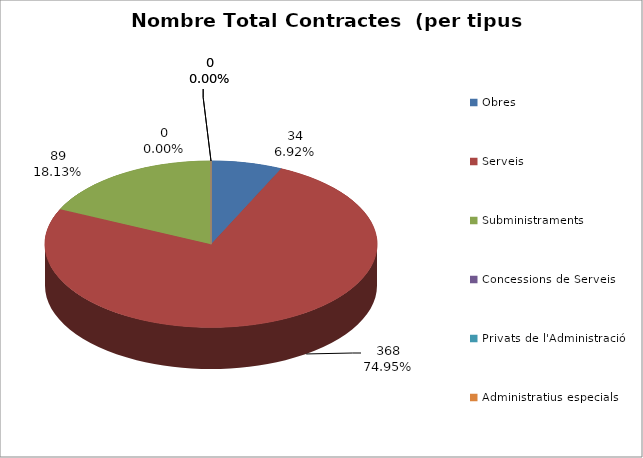
| Category | Nombre Total Contractes |
|---|---|
| Obres | 34 |
| Serveis | 368 |
| Subministraments | 89 |
| Concessions de Serveis | 0 |
| Privats de l'Administració | 0 |
| Administratius especials | 0 |